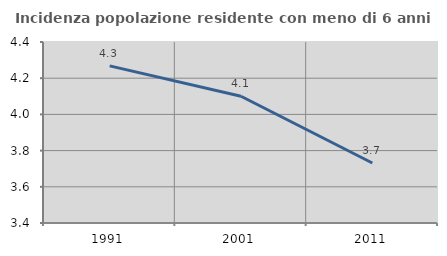
| Category | Incidenza popolazione residente con meno di 6 anni |
|---|---|
| 1991.0 | 4.268 |
| 2001.0 | 4.1 |
| 2011.0 | 3.731 |